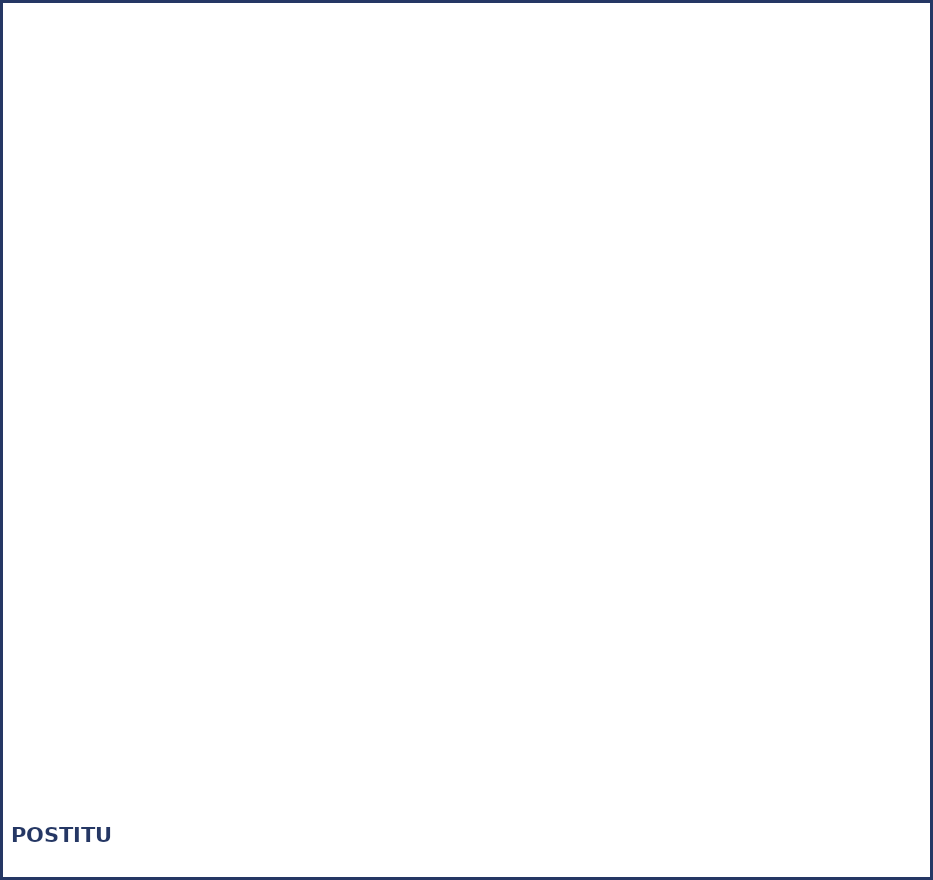
| Category | Series 0 |
|---|---|
| Adventtikalenteri | 0 |
| Lähetetyt kirjeet | 0 |
| Muu postitus | 0 |